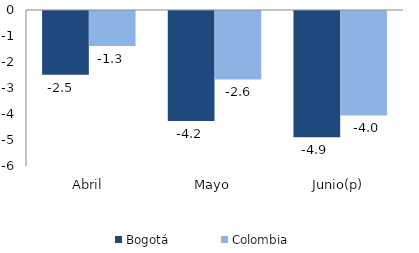
| Category | Bogotá | Colombia |
|---|---|---|
| Abril | -2.451 | -1.343 |
| Mayo | -4.234 | -2.632 |
| Junio(p) | -4.852 | -4.017 |